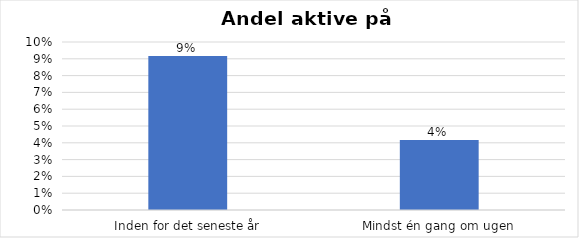
| Category | % |
|---|---|
| Inden for det seneste år | 0.092 |
| Mindst én gang om ugen | 0.042 |